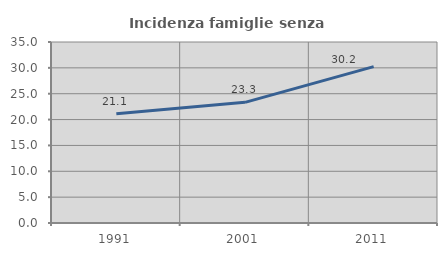
| Category | Incidenza famiglie senza nuclei |
|---|---|
| 1991.0 | 21.117 |
| 2001.0 | 23.335 |
| 2011.0 | 30.244 |